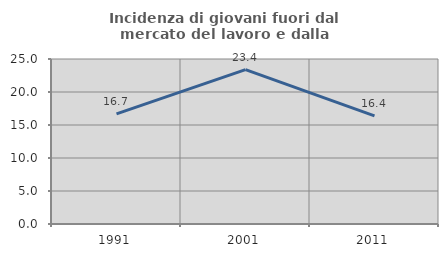
| Category | Incidenza di giovani fuori dal mercato del lavoro e dalla formazione  |
|---|---|
| 1991.0 | 16.686 |
| 2001.0 | 23.385 |
| 2011.0 | 16.384 |